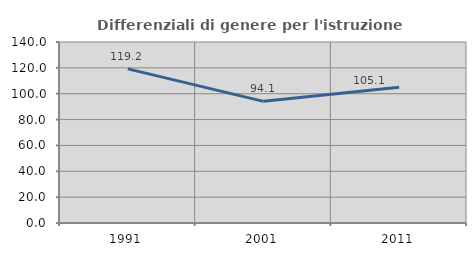
| Category | Differenziali di genere per l'istruzione superiore |
|---|---|
| 1991.0 | 119.203 |
| 2001.0 | 94.093 |
| 2011.0 | 105.083 |